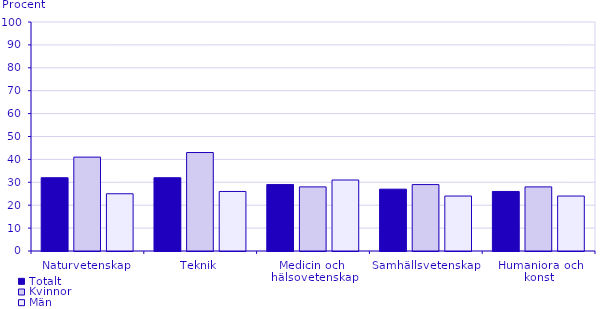
| Category | Totalt | Kvinnor | Män |
|---|---|---|---|
| Naturvetenskap | 32 | 41 | 25 |
| Teknik | 32 | 43 | 26 |
| Medicin och 
hälsovetenskap | 29 | 28 | 31 |
| Samhällsvetenskap | 27 | 29 | 24 |
| Humaniora och konst | 26 | 28 | 24 |